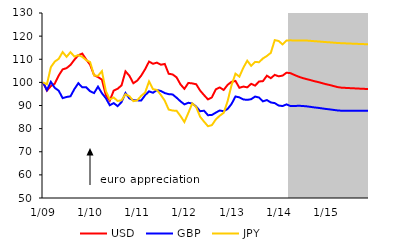
| Category | USD | GBP | JPY |
|---|---|---|---|
|  1/09 | 100 | 100 | 100 |
| 2 | 96.444 | 96.662 | 99.176 |
| 3 | 98.368 | 100.216 | 106.601 |
| 4 | 99.477 | 97.629 | 108.987 |
| 5 | 102.973 | 96.405 | 110.183 |
| 6 | 105.616 | 93.202 | 113.108 |
| 7 | 106.156 | 93.68 | 111.048 |
| 8 | 107.539 | 93.982 | 113.051 |
| 9 | 109.799 | 97.137 | 111.168 |
| 10 | 111.74 | 99.637 | 111.788 |
| 11 | 112.455 | 97.855 | 111.036 |
| 12 | 109.878 | 97.863 | 109.601 |
|  1/10 | 107.602 | 96.159 | 108.761 |
| 2 | 103.119 | 95.379 | 102.987 |
| 3 | 102.3 | 98.147 | 102.837 |
| 4 | 101.2 | 95.306 | 104.85 |
| 5 | 94.508 | 93.159 | 96.277 |
| 6 | 92.095 | 90.111 | 92.63 |
| 7 | 96.44 | 91.035 | 93.462 |
| 8 | 97.236 | 89.717 | 91.949 |
| 9 | 98.7 | 91.492 | 92.262 |
| 10 | 104.778 | 95.398 | 94.879 |
| 11 | 102.846 | 93.051 | 94.041 |
| 12 | 99.616 | 92.32 | 91.878 |
|  1/11 | 100.778 | 92.231 | 92.259 |
| 2 | 102.914 | 92.144 | 94.158 |
| 3 | 105.685 | 94.457 | 95.605 |
| 4 | 108.997 | 96.113 | 100.402 |
| 5 | 108.041 | 95.506 | 97.08 |
| 6 | 108.536 | 96.676 | 96.712 |
| 7 | 107.631 | 96.287 | 94.582 |
| 8 | 107.97 | 95.37 | 92.062 |
| 9 | 103.727 | 94.912 | 88.251 |
| 10 | 103.431 | 94.774 | 87.805 |
| 11 | 102.185 | 93.38 | 87.735 |
| 12 | 99.143 | 91.823 | 85.458 |
|  1/12 | 97.191 | 90.488 | 82.855 |
| 2 | 99.764 | 91.175 | 86.782 |
| 3 | 99.558 | 90.872 | 90.901 |
| 4 | 99.191 | 89.546 | 89.314 |
| 5 | 96.471 | 87.528 | 85.154 |
| 6 | 94.493 | 87.745 | 83.025 |
| 7 | 92.625 | 85.811 | 81.036 |
| 8 | 93.516 | 85.9 | 81.507 |
| 9 | 97.015 | 86.932 | 83.977 |
| 10 | 97.807 | 87.847 | 85.583 |
| 11 | 96.721 | 87.514 | 86.825 |
| 12 | 98.926 | 88.499 | 91.857 |
|  1/13 | 100.228 | 90.653 | 98.766 |
| 2 | 100.633 | 93.901 | 103.768 |
| 3 | 97.651 | 93.512 | 102.482 |
| 4 | 98.192 | 92.613 | 106.326 |
| 5 | 97.847 | 92.44 | 109.37 |
| 6 | 99.383 | 92.73 | 107.144 |
| 7 | 98.598 | 93.854 | 108.862 |
| 8 | 100.37 | 93.462 | 108.705 |
| 9 | 100.545 | 91.796 | 110.349 |
| 10 | 102.886 | 92.358 | 111.417 |
| 11 | 101.811 | 91.325 | 112.762 |
| 12 | 103.246 | 91.04 | 118.264 |
|  1/14 | 102.622 | 89.98 | 117.906 |
| 2 | 102.923 | 89.775 | 116.403 |
| 3 | 104.188 | 90.481 | 118.093 |
| 4 | 103.984 | 89.776 | 118.185 |
| 5 | 103.221 | 89.75 | 118.1 |
| 6 | 102.516 | 89.892 | 118.058 |
| 7 | 101.924 | 89.804 | 118.135 |
| 8 | 101.465 | 89.661 | 118.107 |
| 9 | 101.033 | 89.439 | 117.975 |
| 10 | 100.541 | 89.186 | 117.825 |
| 11 | 100.169 | 88.995 | 117.711 |
| 12 | 99.696 | 88.753 | 117.567 |
|  1/15 | 99.234 | 88.516 | 117.426 |
| 2 | 98.852 | 88.32 | 117.309 |
| 3 | 98.41 | 88.093 | 117.174 |
| 4 | 97.957 | 87.86 | 117.036 |
| 5 | 97.707 | 87.75 | 116.939 |
| 6 | 97.619 | 87.743 | 116.87 |
| 7 | 97.522 | 87.736 | 116.794 |
| 8 | 97.439 | 87.73 | 116.728 |
| 9 | 97.35 | 87.724 | 116.658 |
| 10 | 97.259 | 87.717 | 116.586 |
| 11 | 97.178 | 87.712 | 116.522 |
| 12 | 97.087 | 87.705 | 116.45 |